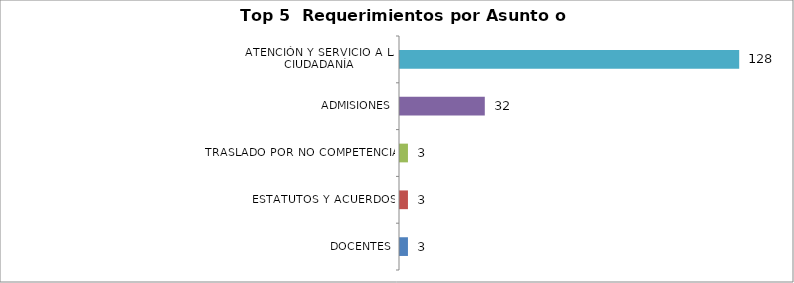
| Category | Total |
|---|---|
| DOCENTES | 3 |
| ESTATUTOS Y ACUERDOS | 3 |
| TRASLADO POR NO COMPETENCIA | 3 |
| ADMISIONES | 32 |
| ATENCIÓN Y SERVICIO A LA CIUDADANÍA | 128 |